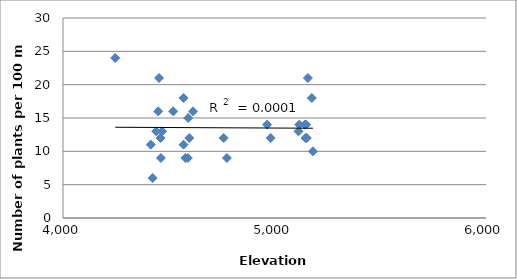
| Category | Number of Plants |
|---|---|
| 4247.0 | 24 |
| 4415.0 | 11 |
| 4424.0 | 6 |
| 4441.0 | 13 |
| 4450.0 | 16 |
| 4454.0 | 21 |
| 4461.0 | 12 |
| 4463.0 | 9 |
| 4469.0 | 13 |
| 4521.0 | 16 |
| 4570.0 | 18 |
| 4570.0 | 11 |
| 4579.0 | 9 |
| 4590.0 | 9 |
| 4592.0 | 15 |
| 4597.0 | 12 |
| 4615.0 | 16 |
| 4760.0 | 12 |
| 4775.0 | 9 |
| 4965.0 | 14 |
| 4982.0 | 12 |
| 5113.512 | 13 |
| 5116.991999999999 | 14 |
| 5143.44 | 14 |
| 5146.571999999999 | 12 |
| 5150.052 | 14 |
| 5152.487999999999 | 12 |
| 5158.056 | 21 |
| 5176.5 | 18 |
| 5181.719999999999 | 10 |